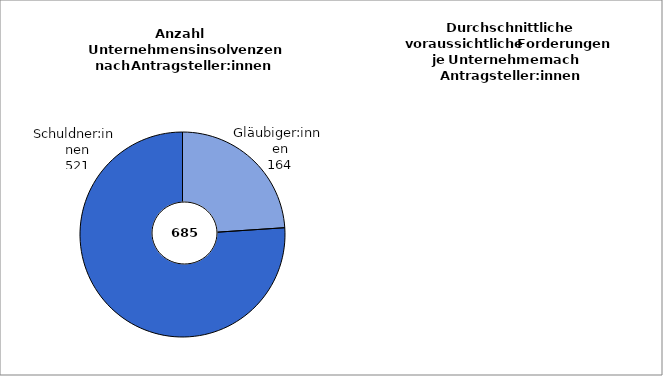
| Category | Series 0 |
|---|---|
| Gläubiger:innen | 164 |
| Schuldner:innen | 521 |